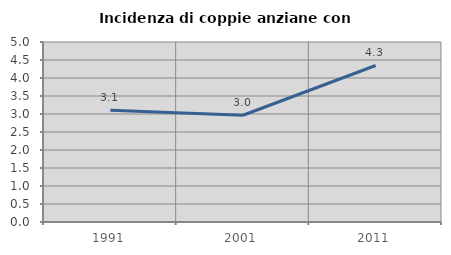
| Category | Incidenza di coppie anziane con figli |
|---|---|
| 1991.0 | 3.103 |
| 2001.0 | 2.965 |
| 2011.0 | 4.348 |